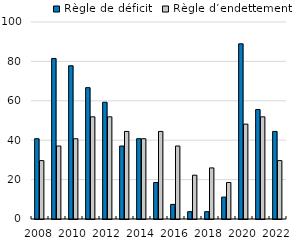
| Category | Règle de déficit | Règle d’endettement |
|---|---|---|
| 2008.0 | 40.741 | 29.63 |
| 2009.0 | 81.481 | 37.037 |
| 2010.0 | 77.778 | 40.741 |
| 2011.0 | 66.667 | 51.852 |
| 2012.0 | 59.259 | 51.852 |
| 2013.0 | 37.037 | 44.444 |
| 2014.0 | 40.741 | 40.741 |
| 2015.0 | 18.519 | 44.444 |
| 2016.0 | 7.407 | 37.037 |
| 2017.0 | 3.704 | 22.222 |
| 2018.0 | 3.704 | 25.926 |
| 2019.0 | 11.111 | 18.519 |
| 2020.0 | 88.889 | 48.148 |
| 2021.0 | 55.556 | 51.852 |
| 2022.0 | 44.444 | 29.63 |